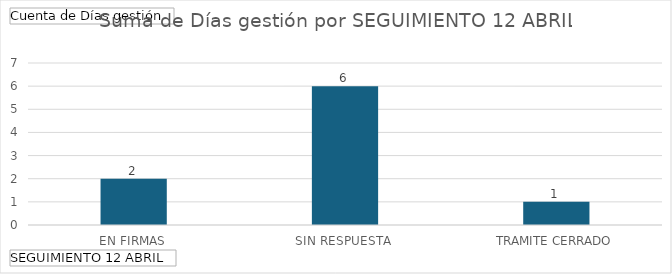
| Category | Total |
|---|---|
| EN FIRMAS | 2 |
| SIN RESPUESTA | 6 |
| TRAMITE CERRADO | 1 |